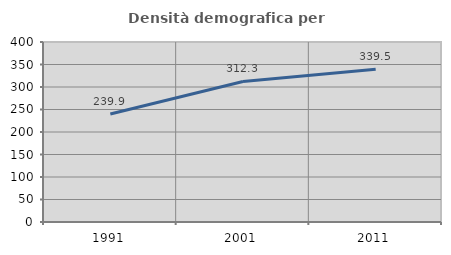
| Category | Densità demografica |
|---|---|
| 1991.0 | 239.86 |
| 2001.0 | 312.323 |
| 2011.0 | 339.539 |